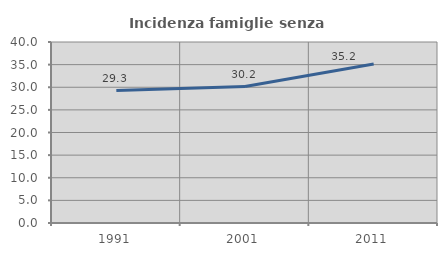
| Category | Incidenza famiglie senza nuclei |
|---|---|
| 1991.0 | 29.259 |
| 2001.0 | 30.162 |
| 2011.0 | 35.152 |